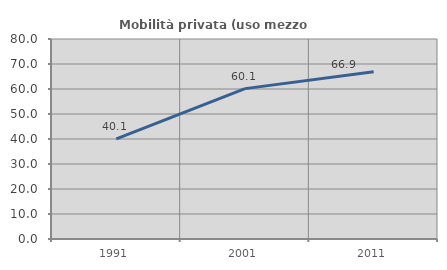
| Category | Mobilità privata (uso mezzo privato) |
|---|---|
| 1991.0 | 40.053 |
| 2001.0 | 60.145 |
| 2011.0 | 66.914 |